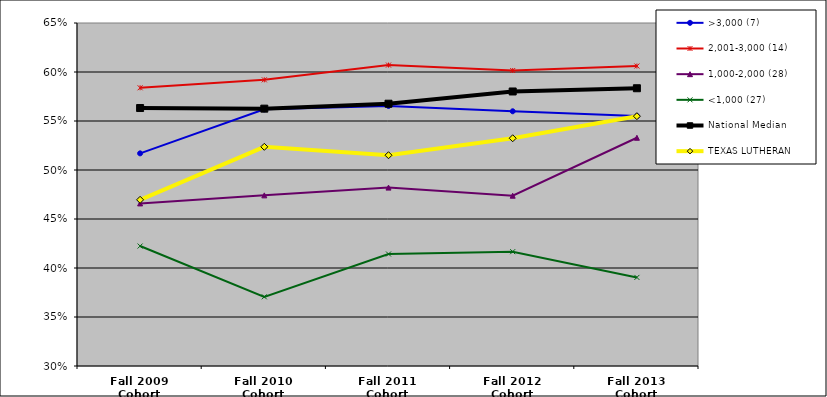
| Category | >3,000 (7) | 2,001-3,000 (14) | 1,000-2,000 (28) | <1,000 (27) | National Median | TEXAS LUTHERAN |
|---|---|---|---|---|---|---|
| Fall 2009 Cohort | 0.517 | 0.584 | 0.466 | 0.422 | 0.563 | 0.47 |
| Fall 2010 Cohort | 0.562 | 0.592 | 0.474 | 0.371 | 0.563 | 0.524 |
| Fall 2011 Cohort | 0.565 | 0.607 | 0.482 | 0.414 | 0.568 | 0.515 |
| Fall 2012 Cohort | 0.56 | 0.602 | 0.474 | 0.417 | 0.58 | 0.532 |
| Fall 2013 Cohort | 0.555 | 0.606 | 0.533 | 0.39 | 0.583 | 0.555 |